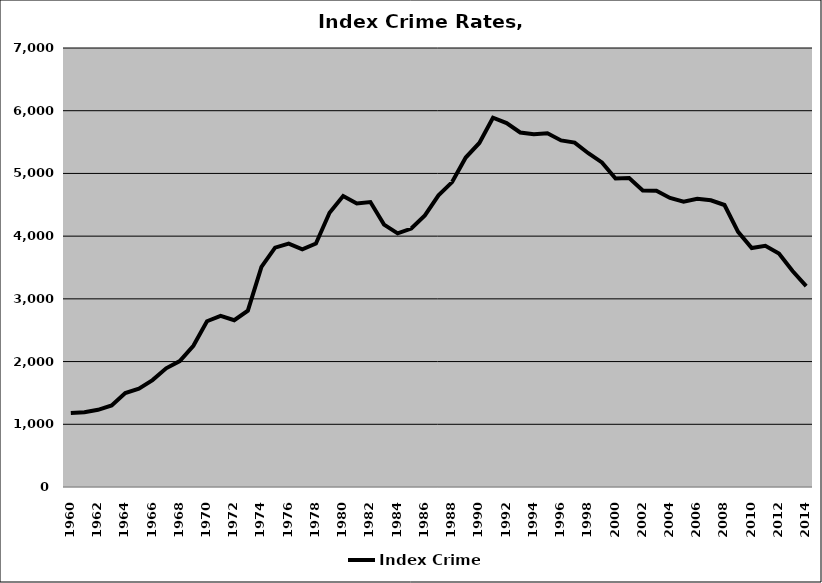
| Category | Index Crime |
|---|---|
| 1960.0 | 1179.459 |
| 1961.0 | 1190.55 |
| 1962.0 | 1230.966 |
| 1963.0 | 1300.735 |
| 1964.0 | 1499.217 |
| 1965.0 | 1568.417 |
| 1966.0 | 1704.22 |
| 1967.0 | 1892.265 |
| 1968.0 | 2006.933 |
| 1969.0 | 2251.681 |
| 1970.0 | 2642.669 |
| 1971.0 | 2729.246 |
| 1972.0 | 2659.148 |
| 1973.0 | 2811.853 |
| 1974.0 | 3511.225 |
| 1975.0 | 3816.731 |
| 1976.0 | 3881.221 |
| 1977.0 | 3791.131 |
| 1978.0 | 3882.123 |
| 1979.0 | 4372.494 |
| 1980.0 | 4640.478 |
| 1981.0 | 4520.215 |
| 1982.0 | 4543.246 |
| 1983.0 | 4183.673 |
| 1984.0 | 4044.152 |
| 1985.0 | 4121.375 |
| 1986.0 | 4331.843 |
| 1987.0 | 4649.867 |
| 1988.0 | 4862.243 |
| 1989.0 | 5253.767 |
| 1990.0 | 5485.864 |
| 1991.0 | 5888.719 |
| 1992.0 | 5802.236 |
| 1993.0 | 5652.34 |
| 1994.0 | 5625.248 |
| 1995.0 | 5639.527 |
| 1996.0 | 5526.205 |
| 1997.0 | 5491.488 |
| 1998.0 | 5322.224 |
| 1999.0 | 5175.558 |
| 2000.0 | 4919.327 |
| 2001.0 | 4926.113 |
| 2002.0 | 4729.527 |
| 2003.0 | 4725.021 |
| 2004.0 | 4608.319 |
| 2005.0 | 4548.941 |
| 2006.0 | 4596.384 |
| 2007.0 | 4571.93 |
| 2008.0 | 4496.636 |
| 2009.0 | 4068.412 |
| 2010.0 | 3810.735 |
| 2011.0 | 3846.472 |
| 2012.0 | 3724.297 |
| 2013.0 | 3444.216 |
| 2014.0 | 3202.586 |